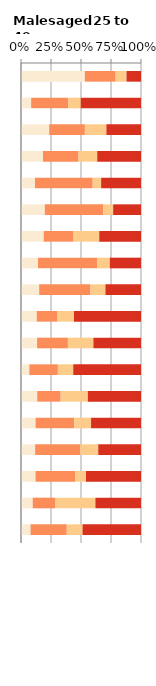
| Category | No qualifications | Below degree level qualifications | Other qualifications | Degree level qualifications |
|---|---|---|---|---|
| White Gypsy or Irish Traveller | 53.191 | 25.671 | 9.065 | 12.073 |
| White Irish | 8.482 | 30.792 | 10.484 | 50.241 |
| Bangladeshi | 23.485 | 29.743 | 17.939 | 28.833 |
| Pakistani | 18.332 | 29.589 | 15.593 | 36.486 |
| White British | 11.619 | 48.138 | 7.015 | 33.228 |
| Mixed White & Black Caribbean | 19.868 | 48.784 | 8.144 | 23.204 |
| Other | 18.93 | 24.856 | 21.434 | 34.781 |
| Black Caribbean | 14.182 | 49.314 | 10.515 | 25.989 |
| Other Black | 15.14 | 42.761 | 12.455 | 29.644 |
| Chinese | 13.103 | 17.339 | 13.714 | 55.844 |
| Other Asian | 13.417 | 25.676 | 21.227 | 39.68 |
| Indian | 6.943 | 23.793 | 12.806 | 56.458 |
| Arab | 13.519 | 19.525 | 22.651 | 44.305 |
| Other Mixed | 12.135 | 32.297 | 13.956 | 41.612 |
| Mixed White & Black African | 11.799 | 37.55 | 15.026 | 35.625 |
| Mixed White & Asian | 12.115 | 33.208 | 8.835 | 45.842 |
| Other White | 9.768 | 19.04 | 33.182 | 38.01 |
| Black African | 7.938 | 30.192 | 13.146 | 48.724 |